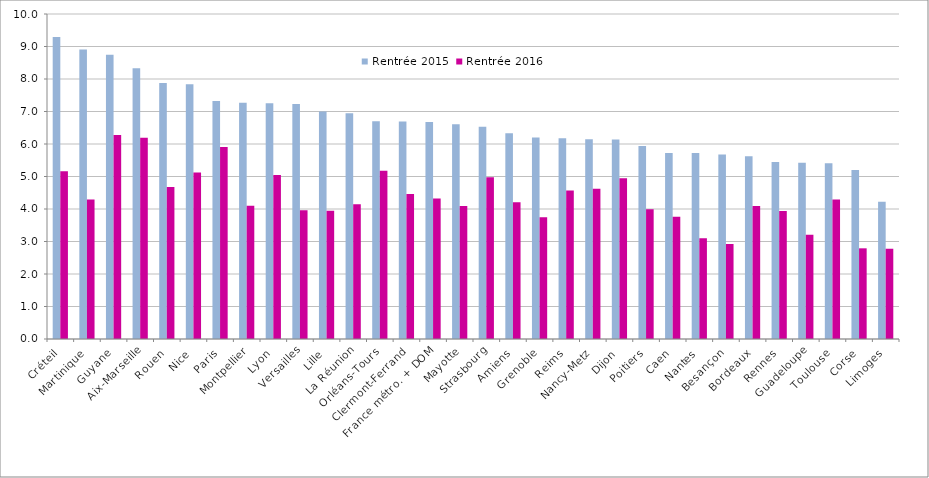
| Category | Rentrée 2015 | Rentrée 2016 |
|---|---|---|
| Créteil | 9.29 | 5.16 |
| Martinique | 8.91 | 4.29 |
| Guyane | 8.75 | 6.28 |
| Aix-Marseille | 8.33 | 6.19 |
| Rouen | 7.88 | 4.68 |
| Nice | 7.84 | 5.12 |
| Paris | 7.32 | 5.91 |
| Montpellier | 7.27 | 4.1 |
| Lyon | 7.25 | 5.05 |
| Versailles | 7.23 | 3.96 |
| Lille | 7 | 3.95 |
| La Réunion | 6.95 | 4.15 |
| Orléans-Tours | 6.7 | 5.18 |
| Clermont-Ferrand | 6.69 | 4.46 |
| France métro. + DOM | 6.68 | 4.32 |
| Mayotte | 6.61 | 4.09 |
| Strasbourg | 6.53 | 4.98 |
| Amiens | 6.33 | 4.21 |
| Grenoble | 6.2 | 3.75 |
| Reims | 6.18 | 4.57 |
| Nancy-Metz | 6.15 | 4.62 |
| Dijon | 6.14 | 4.95 |
| Poitiers | 5.94 | 3.99 |
| Caen | 5.72 | 3.76 |
| Nantes | 5.72 | 3.1 |
| Besançon | 5.68 | 2.92 |
| Bordeaux | 5.62 | 4.09 |
| Rennes | 5.45 | 3.94 |
| Guadeloupe | 5.42 | 3.21 |
| Toulouse | 5.41 | 4.29 |
| Corse | 5.2 | 2.79 |
| Limoges | 4.22 | 2.78 |